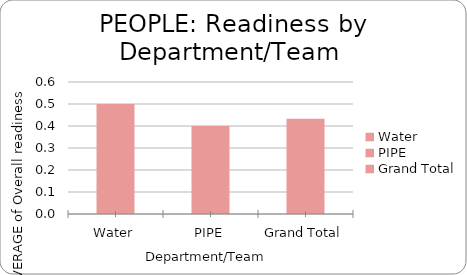
| Category | Average of Overall readiness |
|---|---|
| Water | 0.5 |
| PIPE | 0.4 |
| Grand Total | 0.433 |